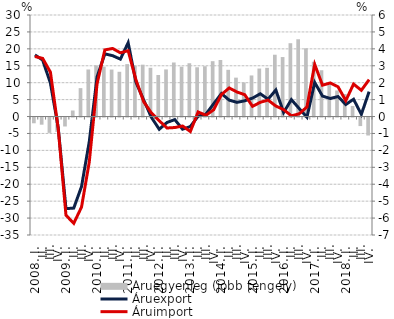
| Category | Áruegyenleg (jobb tengely) |
|---|---|
| 2008. I. | -0.339 |
|          II. | -0.422 |
|          III. | -0.907 |
|          IV. | -0.854 |
| 2009. I. | -0.529 |
|          II. | 0.357 |
|          III. | 1.679 |
|          IV. | 2.781 |
| 2010. I. | 3.022 |
|          II. | 2.95 |
|          III. | 2.777 |
|          IV. | 2.645 |
| 2011. I. | 3.099 |
|          II. | 3.007 |
|          III. | 3.065 |
|          IV. | 2.881 |
| 2012. I. | 2.455 |
|          II. | 2.783 |
|          III. | 3.194 |
|          IV. | 2.946 |
| 2013. I. | 3.15 |
| II. | 2.912 |
|          III. | 2.974 |
| IV. | 3.271 |
| 2014. I. | 3.342 |
| II. | 2.761 |
|          III. | 2.298 |
| IV. | 2.013 |
| 2015. I. | 2.427 |
| II. | 2.836 |
|          III. | 2.878 |
| IV. | 3.653 |
| 2016. I. | 3.515 |
| II. | 4.333 |
|          III. | 4.567 |
| IV. | 4.032 |
| 2017. I. | 3.237 |
| II. | 2.736 |
|          III. | 2.003 |
| IV. | 1.539 |
| 2018. I. | 1.333 |
| II. | 0.626 |
|          III. | -0.505 |
| IV. | -1.061 |